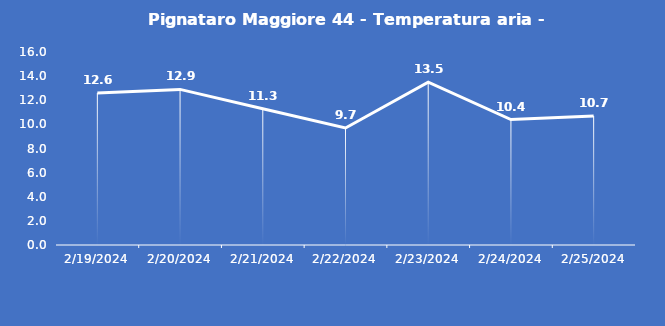
| Category | Pignataro Maggiore 44 - Temperatura aria - Grezzo (°C) |
|---|---|
| 2/19/24 | 12.6 |
| 2/20/24 | 12.9 |
| 2/21/24 | 11.3 |
| 2/22/24 | 9.7 |
| 2/23/24 | 13.5 |
| 2/24/24 | 10.4 |
| 2/25/24 | 10.7 |